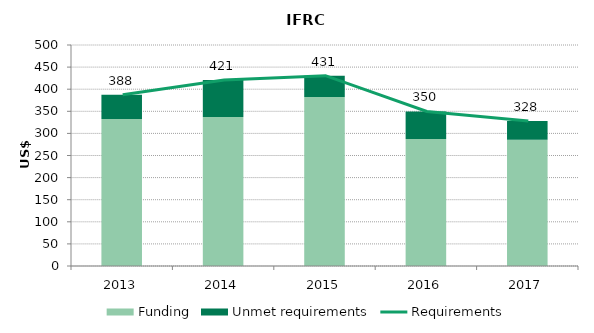
| Category | Funding | Unmet requirements |
|---|---|---|
| 2013.0 | 332.539 | 54.977 |
| 2014.0 | 337.087 | 83.8 |
| 2015.0 | 382.237 | 48.414 |
| 2016.0 | 287.22 | 62.536 |
| 2017.0 | 285.916 | 42.197 |